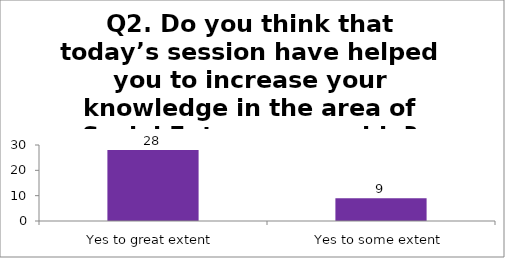
| Category | Q2. Do you think that today’s session have helped you to increase your knowledge in the area of Social Entrepreneurship? |
|---|---|
| Yes to great extent | 28 |
| Yes to some extent | 9 |